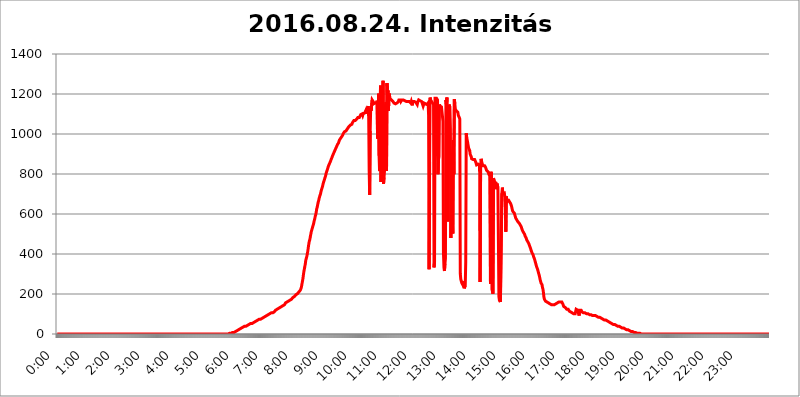
| Category | 2016.08.24. Intenzitás [W/m^2] |
|---|---|
| 0.0 | 0 |
| 0.0006944444444444445 | 0 |
| 0.001388888888888889 | 0 |
| 0.0020833333333333333 | 0 |
| 0.002777777777777778 | 0 |
| 0.003472222222222222 | 0 |
| 0.004166666666666667 | 0 |
| 0.004861111111111111 | 0 |
| 0.005555555555555556 | 0 |
| 0.0062499999999999995 | 0 |
| 0.006944444444444444 | 0 |
| 0.007638888888888889 | 0 |
| 0.008333333333333333 | 0 |
| 0.009027777777777779 | 0 |
| 0.009722222222222222 | 0 |
| 0.010416666666666666 | 0 |
| 0.011111111111111112 | 0 |
| 0.011805555555555555 | 0 |
| 0.012499999999999999 | 0 |
| 0.013194444444444444 | 0 |
| 0.013888888888888888 | 0 |
| 0.014583333333333332 | 0 |
| 0.015277777777777777 | 0 |
| 0.015972222222222224 | 0 |
| 0.016666666666666666 | 0 |
| 0.017361111111111112 | 0 |
| 0.018055555555555557 | 0 |
| 0.01875 | 0 |
| 0.019444444444444445 | 0 |
| 0.02013888888888889 | 0 |
| 0.020833333333333332 | 0 |
| 0.02152777777777778 | 0 |
| 0.022222222222222223 | 0 |
| 0.02291666666666667 | 0 |
| 0.02361111111111111 | 0 |
| 0.024305555555555556 | 0 |
| 0.024999999999999998 | 0 |
| 0.025694444444444447 | 0 |
| 0.02638888888888889 | 0 |
| 0.027083333333333334 | 0 |
| 0.027777777777777776 | 0 |
| 0.02847222222222222 | 0 |
| 0.029166666666666664 | 0 |
| 0.029861111111111113 | 0 |
| 0.030555555555555555 | 0 |
| 0.03125 | 0 |
| 0.03194444444444445 | 0 |
| 0.03263888888888889 | 0 |
| 0.03333333333333333 | 0 |
| 0.034027777777777775 | 0 |
| 0.034722222222222224 | 0 |
| 0.035416666666666666 | 0 |
| 0.036111111111111115 | 0 |
| 0.03680555555555556 | 0 |
| 0.0375 | 0 |
| 0.03819444444444444 | 0 |
| 0.03888888888888889 | 0 |
| 0.03958333333333333 | 0 |
| 0.04027777777777778 | 0 |
| 0.04097222222222222 | 0 |
| 0.041666666666666664 | 0 |
| 0.042361111111111106 | 0 |
| 0.04305555555555556 | 0 |
| 0.043750000000000004 | 0 |
| 0.044444444444444446 | 0 |
| 0.04513888888888889 | 0 |
| 0.04583333333333334 | 0 |
| 0.04652777777777778 | 0 |
| 0.04722222222222222 | 0 |
| 0.04791666666666666 | 0 |
| 0.04861111111111111 | 0 |
| 0.049305555555555554 | 0 |
| 0.049999999999999996 | 0 |
| 0.05069444444444445 | 0 |
| 0.051388888888888894 | 0 |
| 0.052083333333333336 | 0 |
| 0.05277777777777778 | 0 |
| 0.05347222222222222 | 0 |
| 0.05416666666666667 | 0 |
| 0.05486111111111111 | 0 |
| 0.05555555555555555 | 0 |
| 0.05625 | 0 |
| 0.05694444444444444 | 0 |
| 0.057638888888888885 | 0 |
| 0.05833333333333333 | 0 |
| 0.05902777777777778 | 0 |
| 0.059722222222222225 | 0 |
| 0.06041666666666667 | 0 |
| 0.061111111111111116 | 0 |
| 0.06180555555555556 | 0 |
| 0.0625 | 0 |
| 0.06319444444444444 | 0 |
| 0.06388888888888888 | 0 |
| 0.06458333333333334 | 0 |
| 0.06527777777777778 | 0 |
| 0.06597222222222222 | 0 |
| 0.06666666666666667 | 0 |
| 0.06736111111111111 | 0 |
| 0.06805555555555555 | 0 |
| 0.06874999999999999 | 0 |
| 0.06944444444444443 | 0 |
| 0.07013888888888889 | 0 |
| 0.07083333333333333 | 0 |
| 0.07152777777777779 | 0 |
| 0.07222222222222223 | 0 |
| 0.07291666666666667 | 0 |
| 0.07361111111111111 | 0 |
| 0.07430555555555556 | 0 |
| 0.075 | 0 |
| 0.07569444444444444 | 0 |
| 0.0763888888888889 | 0 |
| 0.07708333333333334 | 0 |
| 0.07777777777777778 | 0 |
| 0.07847222222222222 | 0 |
| 0.07916666666666666 | 0 |
| 0.0798611111111111 | 0 |
| 0.08055555555555556 | 0 |
| 0.08125 | 0 |
| 0.08194444444444444 | 0 |
| 0.08263888888888889 | 0 |
| 0.08333333333333333 | 0 |
| 0.08402777777777777 | 0 |
| 0.08472222222222221 | 0 |
| 0.08541666666666665 | 0 |
| 0.08611111111111112 | 0 |
| 0.08680555555555557 | 0 |
| 0.08750000000000001 | 0 |
| 0.08819444444444445 | 0 |
| 0.08888888888888889 | 0 |
| 0.08958333333333333 | 0 |
| 0.09027777777777778 | 0 |
| 0.09097222222222222 | 0 |
| 0.09166666666666667 | 0 |
| 0.09236111111111112 | 0 |
| 0.09305555555555556 | 0 |
| 0.09375 | 0 |
| 0.09444444444444444 | 0 |
| 0.09513888888888888 | 0 |
| 0.09583333333333333 | 0 |
| 0.09652777777777777 | 0 |
| 0.09722222222222222 | 0 |
| 0.09791666666666667 | 0 |
| 0.09861111111111111 | 0 |
| 0.09930555555555555 | 0 |
| 0.09999999999999999 | 0 |
| 0.10069444444444443 | 0 |
| 0.1013888888888889 | 0 |
| 0.10208333333333335 | 0 |
| 0.10277777777777779 | 0 |
| 0.10347222222222223 | 0 |
| 0.10416666666666667 | 0 |
| 0.10486111111111111 | 0 |
| 0.10555555555555556 | 0 |
| 0.10625 | 0 |
| 0.10694444444444444 | 0 |
| 0.1076388888888889 | 0 |
| 0.10833333333333334 | 0 |
| 0.10902777777777778 | 0 |
| 0.10972222222222222 | 0 |
| 0.1111111111111111 | 0 |
| 0.11180555555555556 | 0 |
| 0.11180555555555556 | 0 |
| 0.1125 | 0 |
| 0.11319444444444444 | 0 |
| 0.11388888888888889 | 0 |
| 0.11458333333333333 | 0 |
| 0.11527777777777777 | 0 |
| 0.11597222222222221 | 0 |
| 0.11666666666666665 | 0 |
| 0.1173611111111111 | 0 |
| 0.11805555555555557 | 0 |
| 0.11944444444444445 | 0 |
| 0.12013888888888889 | 0 |
| 0.12083333333333333 | 0 |
| 0.12152777777777778 | 0 |
| 0.12222222222222223 | 0 |
| 0.12291666666666667 | 0 |
| 0.12291666666666667 | 0 |
| 0.12361111111111112 | 0 |
| 0.12430555555555556 | 0 |
| 0.125 | 0 |
| 0.12569444444444444 | 0 |
| 0.12638888888888888 | 0 |
| 0.12708333333333333 | 0 |
| 0.16875 | 0 |
| 0.12847222222222224 | 0 |
| 0.12916666666666668 | 0 |
| 0.12986111111111112 | 0 |
| 0.13055555555555556 | 0 |
| 0.13125 | 0 |
| 0.13194444444444445 | 0 |
| 0.1326388888888889 | 0 |
| 0.13333333333333333 | 0 |
| 0.13402777777777777 | 0 |
| 0.13402777777777777 | 0 |
| 0.13472222222222222 | 0 |
| 0.13541666666666666 | 0 |
| 0.1361111111111111 | 0 |
| 0.13749999999999998 | 0 |
| 0.13819444444444443 | 0 |
| 0.1388888888888889 | 0 |
| 0.13958333333333334 | 0 |
| 0.14027777777777778 | 0 |
| 0.14097222222222222 | 0 |
| 0.14166666666666666 | 0 |
| 0.1423611111111111 | 0 |
| 0.14305555555555557 | 0 |
| 0.14375000000000002 | 0 |
| 0.14444444444444446 | 0 |
| 0.1451388888888889 | 0 |
| 0.1451388888888889 | 0 |
| 0.14652777777777778 | 0 |
| 0.14722222222222223 | 0 |
| 0.14791666666666667 | 0 |
| 0.1486111111111111 | 0 |
| 0.14930555555555555 | 0 |
| 0.15 | 0 |
| 0.15069444444444444 | 0 |
| 0.15138888888888888 | 0 |
| 0.15208333333333332 | 0 |
| 0.15277777777777776 | 0 |
| 0.15347222222222223 | 0 |
| 0.15416666666666667 | 0 |
| 0.15486111111111112 | 0 |
| 0.15555555555555556 | 0 |
| 0.15625 | 0 |
| 0.15694444444444444 | 0 |
| 0.15763888888888888 | 0 |
| 0.15833333333333333 | 0 |
| 0.15902777777777777 | 0 |
| 0.15972222222222224 | 0 |
| 0.16041666666666668 | 0 |
| 0.16111111111111112 | 0 |
| 0.16180555555555556 | 0 |
| 0.1625 | 0 |
| 0.16319444444444445 | 0 |
| 0.1638888888888889 | 0 |
| 0.16458333333333333 | 0 |
| 0.16527777777777777 | 0 |
| 0.16597222222222222 | 0 |
| 0.16666666666666666 | 0 |
| 0.1673611111111111 | 0 |
| 0.16805555555555554 | 0 |
| 0.16874999999999998 | 0 |
| 0.16944444444444443 | 0 |
| 0.17013888888888887 | 0 |
| 0.1708333333333333 | 0 |
| 0.17152777777777775 | 0 |
| 0.17222222222222225 | 0 |
| 0.1729166666666667 | 0 |
| 0.17361111111111113 | 0 |
| 0.17430555555555557 | 0 |
| 0.17500000000000002 | 0 |
| 0.17569444444444446 | 0 |
| 0.1763888888888889 | 0 |
| 0.17708333333333334 | 0 |
| 0.17777777777777778 | 0 |
| 0.17847222222222223 | 0 |
| 0.17916666666666667 | 0 |
| 0.1798611111111111 | 0 |
| 0.18055555555555555 | 0 |
| 0.18125 | 0 |
| 0.18194444444444444 | 0 |
| 0.1826388888888889 | 0 |
| 0.18333333333333335 | 0 |
| 0.1840277777777778 | 0 |
| 0.18472222222222223 | 0 |
| 0.18541666666666667 | 0 |
| 0.18611111111111112 | 0 |
| 0.18680555555555556 | 0 |
| 0.1875 | 0 |
| 0.18819444444444444 | 0 |
| 0.18888888888888888 | 0 |
| 0.18958333333333333 | 0 |
| 0.19027777777777777 | 0 |
| 0.1909722222222222 | 0 |
| 0.19166666666666665 | 0 |
| 0.19236111111111112 | 0 |
| 0.19305555555555554 | 0 |
| 0.19375 | 0 |
| 0.19444444444444445 | 0 |
| 0.1951388888888889 | 0 |
| 0.19583333333333333 | 0 |
| 0.19652777777777777 | 0 |
| 0.19722222222222222 | 0 |
| 0.19791666666666666 | 0 |
| 0.1986111111111111 | 0 |
| 0.19930555555555554 | 0 |
| 0.19999999999999998 | 0 |
| 0.20069444444444443 | 0 |
| 0.20138888888888887 | 0 |
| 0.2020833333333333 | 0 |
| 0.2027777777777778 | 0 |
| 0.2034722222222222 | 0 |
| 0.2041666666666667 | 0 |
| 0.20486111111111113 | 0 |
| 0.20555555555555557 | 0 |
| 0.20625000000000002 | 0 |
| 0.20694444444444446 | 0 |
| 0.2076388888888889 | 0 |
| 0.20833333333333334 | 0 |
| 0.20902777777777778 | 0 |
| 0.20972222222222223 | 0 |
| 0.21041666666666667 | 0 |
| 0.2111111111111111 | 0 |
| 0.21180555555555555 | 0 |
| 0.2125 | 0 |
| 0.21319444444444444 | 0 |
| 0.2138888888888889 | 0 |
| 0.21458333333333335 | 0 |
| 0.2152777777777778 | 0 |
| 0.21597222222222223 | 0 |
| 0.21666666666666667 | 0 |
| 0.21736111111111112 | 0 |
| 0.21805555555555556 | 0 |
| 0.21875 | 0 |
| 0.21944444444444444 | 0 |
| 0.22013888888888888 | 0 |
| 0.22083333333333333 | 0 |
| 0.22152777777777777 | 0 |
| 0.2222222222222222 | 0 |
| 0.22291666666666665 | 0 |
| 0.2236111111111111 | 0 |
| 0.22430555555555556 | 0 |
| 0.225 | 0 |
| 0.22569444444444445 | 0 |
| 0.2263888888888889 | 0 |
| 0.22708333333333333 | 0 |
| 0.22777777777777777 | 0 |
| 0.22847222222222222 | 0 |
| 0.22916666666666666 | 0 |
| 0.2298611111111111 | 0 |
| 0.23055555555555554 | 0 |
| 0.23124999999999998 | 0 |
| 0.23194444444444443 | 0 |
| 0.23263888888888887 | 0 |
| 0.2333333333333333 | 0 |
| 0.2340277777777778 | 0 |
| 0.2347222222222222 | 0 |
| 0.2354166666666667 | 0 |
| 0.23611111111111113 | 0 |
| 0.23680555555555557 | 0 |
| 0.23750000000000002 | 0 |
| 0.23819444444444446 | 0 |
| 0.2388888888888889 | 0 |
| 0.23958333333333334 | 0 |
| 0.24027777777777778 | 3.525 |
| 0.24097222222222223 | 3.525 |
| 0.24166666666666667 | 3.525 |
| 0.2423611111111111 | 3.525 |
| 0.24305555555555555 | 3.525 |
| 0.24375 | 3.525 |
| 0.24444444444444446 | 3.525 |
| 0.24513888888888888 | 7.887 |
| 0.24583333333333335 | 7.887 |
| 0.2465277777777778 | 7.887 |
| 0.24722222222222223 | 7.887 |
| 0.24791666666666667 | 7.887 |
| 0.24861111111111112 | 12.257 |
| 0.24930555555555556 | 12.257 |
| 0.25 | 12.257 |
| 0.25069444444444444 | 12.257 |
| 0.2513888888888889 | 16.636 |
| 0.2520833333333333 | 16.636 |
| 0.25277777777777777 | 21.024 |
| 0.2534722222222222 | 21.024 |
| 0.25416666666666665 | 21.024 |
| 0.2548611111111111 | 21.024 |
| 0.2555555555555556 | 25.419 |
| 0.25625000000000003 | 25.419 |
| 0.2569444444444445 | 25.419 |
| 0.2576388888888889 | 29.823 |
| 0.25833333333333336 | 29.823 |
| 0.2590277777777778 | 29.823 |
| 0.25972222222222224 | 29.823 |
| 0.2604166666666667 | 34.234 |
| 0.2611111111111111 | 34.234 |
| 0.26180555555555557 | 34.234 |
| 0.2625 | 38.653 |
| 0.26319444444444445 | 38.653 |
| 0.2638888888888889 | 38.653 |
| 0.26458333333333334 | 38.653 |
| 0.2652777777777778 | 38.653 |
| 0.2659722222222222 | 43.079 |
| 0.26666666666666666 | 43.079 |
| 0.2673611111111111 | 43.079 |
| 0.26805555555555555 | 47.511 |
| 0.26875 | 47.511 |
| 0.26944444444444443 | 47.511 |
| 0.2701388888888889 | 47.511 |
| 0.2708333333333333 | 51.951 |
| 0.27152777777777776 | 51.951 |
| 0.2722222222222222 | 51.951 |
| 0.27291666666666664 | 51.951 |
| 0.2736111111111111 | 56.398 |
| 0.2743055555555555 | 56.398 |
| 0.27499999999999997 | 56.398 |
| 0.27569444444444446 | 60.85 |
| 0.27638888888888885 | 60.85 |
| 0.27708333333333335 | 60.85 |
| 0.2777777777777778 | 65.31 |
| 0.27847222222222223 | 65.31 |
| 0.2791666666666667 | 65.31 |
| 0.2798611111111111 | 65.31 |
| 0.28055555555555556 | 69.775 |
| 0.28125 | 69.775 |
| 0.28194444444444444 | 69.775 |
| 0.2826388888888889 | 69.775 |
| 0.2833333333333333 | 74.246 |
| 0.28402777777777777 | 74.246 |
| 0.2847222222222222 | 74.246 |
| 0.28541666666666665 | 74.246 |
| 0.28611111111111115 | 78.722 |
| 0.28680555555555554 | 78.722 |
| 0.28750000000000003 | 78.722 |
| 0.2881944444444445 | 78.722 |
| 0.2888888888888889 | 83.205 |
| 0.28958333333333336 | 83.205 |
| 0.2902777777777778 | 83.205 |
| 0.29097222222222224 | 87.692 |
| 0.2916666666666667 | 87.692 |
| 0.2923611111111111 | 87.692 |
| 0.29305555555555557 | 92.184 |
| 0.29375 | 92.184 |
| 0.29444444444444445 | 92.184 |
| 0.2951388888888889 | 92.184 |
| 0.29583333333333334 | 96.682 |
| 0.2965277777777778 | 96.682 |
| 0.2972222222222222 | 101.184 |
| 0.29791666666666666 | 101.184 |
| 0.2986111111111111 | 101.184 |
| 0.29930555555555555 | 101.184 |
| 0.3 | 105.69 |
| 0.30069444444444443 | 105.69 |
| 0.3013888888888889 | 105.69 |
| 0.3020833333333333 | 105.69 |
| 0.30277777777777776 | 110.201 |
| 0.3034722222222222 | 110.201 |
| 0.30416666666666664 | 110.201 |
| 0.3048611111111111 | 114.716 |
| 0.3055555555555555 | 114.716 |
| 0.30624999999999997 | 119.235 |
| 0.3069444444444444 | 119.235 |
| 0.3076388888888889 | 119.235 |
| 0.30833333333333335 | 123.758 |
| 0.3090277777777778 | 123.758 |
| 0.30972222222222223 | 128.284 |
| 0.3104166666666667 | 128.284 |
| 0.3111111111111111 | 128.284 |
| 0.31180555555555556 | 132.814 |
| 0.3125 | 132.814 |
| 0.31319444444444444 | 132.814 |
| 0.3138888888888889 | 137.347 |
| 0.3145833333333333 | 137.347 |
| 0.31527777777777777 | 137.347 |
| 0.3159722222222222 | 141.884 |
| 0.31666666666666665 | 141.884 |
| 0.31736111111111115 | 146.423 |
| 0.31805555555555554 | 146.423 |
| 0.31875000000000003 | 146.423 |
| 0.3194444444444445 | 150.964 |
| 0.3201388888888889 | 155.509 |
| 0.32083333333333336 | 155.509 |
| 0.3215277777777778 | 155.509 |
| 0.32222222222222224 | 160.056 |
| 0.3229166666666667 | 160.056 |
| 0.3236111111111111 | 164.605 |
| 0.32430555555555557 | 164.605 |
| 0.325 | 164.605 |
| 0.32569444444444445 | 169.156 |
| 0.3263888888888889 | 169.156 |
| 0.32708333333333334 | 173.709 |
| 0.3277777777777778 | 173.709 |
| 0.3284722222222222 | 173.709 |
| 0.32916666666666666 | 178.264 |
| 0.3298611111111111 | 178.264 |
| 0.33055555555555555 | 182.82 |
| 0.33125 | 182.82 |
| 0.33194444444444443 | 187.378 |
| 0.3326388888888889 | 187.378 |
| 0.3333333333333333 | 191.937 |
| 0.3340277777777778 | 191.937 |
| 0.3347222222222222 | 196.497 |
| 0.3354166666666667 | 196.497 |
| 0.3361111111111111 | 201.058 |
| 0.3368055555555556 | 201.058 |
| 0.33749999999999997 | 205.62 |
| 0.33819444444444446 | 205.62 |
| 0.33888888888888885 | 210.182 |
| 0.33958333333333335 | 210.182 |
| 0.34027777777777773 | 214.746 |
| 0.34097222222222223 | 219.309 |
| 0.3416666666666666 | 223.873 |
| 0.3423611111111111 | 233 |
| 0.3430555555555555 | 246.689 |
| 0.34375 | 260.373 |
| 0.3444444444444445 | 274.047 |
| 0.3451388888888889 | 292.259 |
| 0.3458333333333334 | 310.44 |
| 0.34652777777777777 | 324.052 |
| 0.34722222222222227 | 337.639 |
| 0.34791666666666665 | 351.198 |
| 0.34861111111111115 | 369.23 |
| 0.34930555555555554 | 378.224 |
| 0.35000000000000003 | 387.202 |
| 0.3506944444444444 | 400.638 |
| 0.3513888888888889 | 414.035 |
| 0.3520833333333333 | 431.833 |
| 0.3527777777777778 | 449.551 |
| 0.3534722222222222 | 462.786 |
| 0.3541666666666667 | 471.582 |
| 0.3548611111111111 | 484.735 |
| 0.35555555555555557 | 497.836 |
| 0.35625 | 510.885 |
| 0.35694444444444445 | 519.555 |
| 0.3576388888888889 | 528.2 |
| 0.35833333333333334 | 536.82 |
| 0.3590277777777778 | 545.416 |
| 0.3597222222222222 | 553.986 |
| 0.36041666666666666 | 566.793 |
| 0.3611111111111111 | 575.299 |
| 0.36180555555555555 | 588.009 |
| 0.3625 | 596.45 |
| 0.36319444444444443 | 609.062 |
| 0.3638888888888889 | 625.784 |
| 0.3645833333333333 | 634.105 |
| 0.3652777777777778 | 646.537 |
| 0.3659722222222222 | 658.909 |
| 0.3666666666666667 | 667.123 |
| 0.3673611111111111 | 679.395 |
| 0.3680555555555556 | 683.473 |
| 0.36874999999999997 | 695.666 |
| 0.36944444444444446 | 703.762 |
| 0.37013888888888885 | 715.858 |
| 0.37083333333333335 | 719.877 |
| 0.37152777777777773 | 731.896 |
| 0.37222222222222223 | 739.877 |
| 0.3729166666666666 | 751.803 |
| 0.3736111111111111 | 759.723 |
| 0.3743055555555555 | 767.62 |
| 0.375 | 775.492 |
| 0.3756944444444445 | 783.342 |
| 0.3763888888888889 | 791.169 |
| 0.3770833333333334 | 802.868 |
| 0.37777777777777777 | 810.641 |
| 0.37847222222222227 | 818.392 |
| 0.37916666666666665 | 826.123 |
| 0.37986111111111115 | 829.981 |
| 0.38055555555555554 | 841.526 |
| 0.38125000000000003 | 845.365 |
| 0.3819444444444444 | 853.029 |
| 0.3826388888888889 | 856.855 |
| 0.3833333333333333 | 864.493 |
| 0.3840277777777778 | 872.114 |
| 0.3847222222222222 | 875.918 |
| 0.3854166666666667 | 883.516 |
| 0.3861111111111111 | 891.099 |
| 0.38680555555555557 | 894.885 |
| 0.3875 | 902.447 |
| 0.38819444444444445 | 906.223 |
| 0.3888888888888889 | 913.766 |
| 0.38958333333333334 | 917.534 |
| 0.3902777777777778 | 925.06 |
| 0.3909722222222222 | 928.819 |
| 0.39166666666666666 | 936.33 |
| 0.3923611111111111 | 940.082 |
| 0.39305555555555555 | 947.58 |
| 0.39375 | 947.58 |
| 0.39444444444444443 | 955.071 |
| 0.3951388888888889 | 958.814 |
| 0.3958333333333333 | 970.034 |
| 0.3965277777777778 | 970.034 |
| 0.3972222222222222 | 977.508 |
| 0.3979166666666667 | 981.244 |
| 0.3986111111111111 | 984.98 |
| 0.3993055555555556 | 988.714 |
| 0.39999999999999997 | 992.448 |
| 0.40069444444444446 | 996.182 |
| 0.40138888888888885 | 1003.65 |
| 0.40208333333333335 | 1003.65 |
| 0.40277777777777773 | 1011.118 |
| 0.40347222222222223 | 1011.118 |
| 0.4041666666666666 | 1014.852 |
| 0.4048611111111111 | 1014.852 |
| 0.4055555555555555 | 1018.587 |
| 0.40625 | 1022.323 |
| 0.4069444444444445 | 1026.06 |
| 0.4076388888888889 | 1029.798 |
| 0.4083333333333334 | 1033.537 |
| 0.40902777777777777 | 1037.277 |
| 0.40972222222222227 | 1037.277 |
| 0.41041666666666665 | 1037.277 |
| 0.41111111111111115 | 1044.762 |
| 0.41180555555555554 | 1048.508 |
| 0.41250000000000003 | 1048.508 |
| 0.4131944444444444 | 1048.508 |
| 0.4138888888888889 | 1056.004 |
| 0.4145833333333333 | 1059.756 |
| 0.4152777777777778 | 1059.756 |
| 0.4159722222222222 | 1067.267 |
| 0.4166666666666667 | 1067.267 |
| 0.4173611111111111 | 1067.267 |
| 0.41805555555555557 | 1067.267 |
| 0.41875 | 1071.027 |
| 0.41944444444444445 | 1071.027 |
| 0.4201388888888889 | 1074.789 |
| 0.42083333333333334 | 1078.555 |
| 0.4215277777777778 | 1082.324 |
| 0.4222222222222222 | 1082.324 |
| 0.42291666666666666 | 1082.324 |
| 0.4236111111111111 | 1082.324 |
| 0.42430555555555555 | 1082.324 |
| 0.425 | 1086.097 |
| 0.42569444444444443 | 1097.437 |
| 0.4263888888888889 | 1097.437 |
| 0.4270833333333333 | 1097.437 |
| 0.4277777777777778 | 1101.226 |
| 0.4284722222222222 | 1093.653 |
| 0.4291666666666667 | 1101.226 |
| 0.4298611111111111 | 1101.226 |
| 0.4305555555555556 | 1101.226 |
| 0.43124999999999997 | 1105.019 |
| 0.43194444444444446 | 1108.816 |
| 0.43263888888888885 | 1116.426 |
| 0.43333333333333335 | 1101.226 |
| 0.43402777777777773 | 1120.238 |
| 0.43472222222222223 | 1120.238 |
| 0.4354166666666666 | 1124.056 |
| 0.4361111111111111 | 1139.384 |
| 0.4368055555555555 | 1089.873 |
| 0.4375 | 814.519 |
| 0.4381944444444445 | 695.666 |
| 0.4388888888888889 | 1014.852 |
| 0.4395833333333334 | 1127.879 |
| 0.44027777777777777 | 1116.426 |
| 0.44097222222222227 | 1120.238 |
| 0.44166666666666665 | 1170.358 |
| 0.44236111111111115 | 1170.358 |
| 0.44305555555555554 | 1162.571 |
| 0.44375000000000003 | 1150.946 |
| 0.4444444444444444 | 1150.946 |
| 0.4451388888888889 | 1150.946 |
| 0.4458333333333333 | 1154.814 |
| 0.4465277777777778 | 1154.814 |
| 0.4472222222222222 | 1150.946 |
| 0.4479166666666667 | 1154.814 |
| 0.4486111111111111 | 1166.46 |
| 0.44930555555555557 | 977.508 |
| 0.45 | 1033.537 |
| 0.45069444444444445 | 1201.843 |
| 0.4513888888888889 | 891.099 |
| 0.45208333333333334 | 814.519 |
| 0.4527777777777778 | 1162.571 |
| 0.4534722222222222 | 1242.089 |
| 0.45416666666666666 | 759.723 |
| 0.4548611111111111 | 921.298 |
| 0.45555555555555555 | 966.295 |
| 0.45625 | 1007.383 |
| 0.45694444444444443 | 1266.8 |
| 0.4576388888888889 | 751.803 |
| 0.4583333333333333 | 783.342 |
| 0.4590277777777778 | 818.392 |
| 0.4597222222222222 | 1147.086 |
| 0.4604166666666667 | 951.327 |
| 0.4611111111111111 | 1158.689 |
| 0.4618055555555556 | 814.519 |
| 0.46249999999999997 | 1254.387 |
| 0.46319444444444446 | 1189.969 |
| 0.46388888888888885 | 1217.812 |
| 0.46458333333333335 | 1116.426 |
| 0.46527777777777773 | 1201.843 |
| 0.46597222222222223 | 1193.918 |
| 0.4666666666666666 | 1178.177 |
| 0.4673611111111111 | 1174.263 |
| 0.4680555555555555 | 1178.177 |
| 0.46875 | 1170.358 |
| 0.4694444444444445 | 1170.358 |
| 0.4701388888888889 | 1166.46 |
| 0.4708333333333334 | 1162.571 |
| 0.47152777777777777 | 1162.571 |
| 0.47222222222222227 | 1154.814 |
| 0.47291666666666665 | 1154.814 |
| 0.47361111111111115 | 1150.946 |
| 0.47430555555555554 | 1150.946 |
| 0.47500000000000003 | 1150.946 |
| 0.4756944444444444 | 1154.814 |
| 0.4763888888888889 | 1154.814 |
| 0.4770833333333333 | 1154.814 |
| 0.4777777777777778 | 1158.689 |
| 0.4784722222222222 | 1162.571 |
| 0.4791666666666667 | 1170.358 |
| 0.4798611111111111 | 1174.263 |
| 0.48055555555555557 | 1174.263 |
| 0.48125 | 1170.358 |
| 0.48194444444444445 | 1162.571 |
| 0.4826388888888889 | 1162.571 |
| 0.48333333333333334 | 1170.358 |
| 0.4840277777777778 | 1170.358 |
| 0.4847222222222222 | 1170.358 |
| 0.48541666666666666 | 1170.358 |
| 0.4861111111111111 | 1170.358 |
| 0.48680555555555555 | 1170.358 |
| 0.4875 | 1166.46 |
| 0.48819444444444443 | 1162.571 |
| 0.4888888888888889 | 1162.571 |
| 0.4895833333333333 | 1162.571 |
| 0.4902777777777778 | 1166.46 |
| 0.4909722222222222 | 1162.571 |
| 0.4916666666666667 | 1162.571 |
| 0.4923611111111111 | 1162.571 |
| 0.4930555555555556 | 1162.571 |
| 0.49374999999999997 | 1162.571 |
| 0.49444444444444446 | 1162.571 |
| 0.49513888888888885 | 1162.571 |
| 0.49583333333333335 | 1154.814 |
| 0.49652777777777773 | 1162.571 |
| 0.49722222222222223 | 1158.689 |
| 0.4979166666666666 | 1143.232 |
| 0.4986111111111111 | 1162.571 |
| 0.4993055555555555 | 1166.46 |
| 0.5 | 1166.46 |
| 0.5006944444444444 | 1162.571 |
| 0.5013888888888889 | 1166.46 |
| 0.5020833333333333 | 1162.571 |
| 0.5027777777777778 | 1158.689 |
| 0.5034722222222222 | 1162.571 |
| 0.5041666666666667 | 1158.689 |
| 0.5048611111111111 | 1147.086 |
| 0.5055555555555555 | 1158.689 |
| 0.50625 | 1158.689 |
| 0.5069444444444444 | 1170.358 |
| 0.5076388888888889 | 1174.263 |
| 0.5083333333333333 | 1174.263 |
| 0.5090277777777777 | 1166.46 |
| 0.5097222222222222 | 1170.358 |
| 0.5104166666666666 | 1166.46 |
| 0.5111111111111112 | 1162.571 |
| 0.5118055555555555 | 1154.814 |
| 0.5125000000000001 | 1147.086 |
| 0.5131944444444444 | 1139.384 |
| 0.513888888888889 | 1147.086 |
| 0.5145833333333333 | 1154.814 |
| 0.5152777777777778 | 1158.689 |
| 0.5159722222222222 | 1154.814 |
| 0.5166666666666667 | 1150.946 |
| 0.517361111111111 | 1147.086 |
| 0.5180555555555556 | 1150.946 |
| 0.5187499999999999 | 1147.086 |
| 0.5194444444444445 | 1147.086 |
| 0.5201388888888888 | 1154.814 |
| 0.5208333333333334 | 1093.653 |
| 0.5215277777777778 | 324.052 |
| 0.5222222222222223 | 860.676 |
| 0.5229166666666667 | 1182.099 |
| 0.5236111111111111 | 1170.358 |
| 0.5243055555555556 | 1166.46 |
| 0.525 | 1166.46 |
| 0.5256944444444445 | 1158.689 |
| 0.5263888888888889 | 1154.814 |
| 0.5270833333333333 | 1154.814 |
| 0.5277777777777778 | 1147.086 |
| 0.5284722222222222 | 333.113 |
| 0.5291666666666667 | 360.221 |
| 0.5298611111111111 | 1178.177 |
| 0.5305555555555556 | 1178.177 |
| 0.53125 | 1178.177 |
| 0.5319444444444444 | 1178.177 |
| 0.5326388888888889 | 1174.263 |
| 0.5333333333333333 | 1170.358 |
| 0.5340277777777778 | 798.974 |
| 0.5347222222222222 | 872.114 |
| 0.5354166666666667 | 887.309 |
| 0.5361111111111111 | 1147.086 |
| 0.5368055555555555 | 1139.384 |
| 0.5375 | 1139.384 |
| 0.5381944444444444 | 1135.543 |
| 0.5388888888888889 | 1135.543 |
| 0.5395833333333333 | 1139.384 |
| 0.5402777777777777 | 1135.543 |
| 0.5409722222222222 | 1063.51 |
| 0.5416666666666666 | 405.108 |
| 0.5423611111111112 | 333.113 |
| 0.5430555555555555 | 314.98 |
| 0.5437500000000001 | 351.198 |
| 0.5444444444444444 | 378.224 |
| 0.545138888888889 | 1170.358 |
| 0.5458333333333333 | 1147.086 |
| 0.5465277777777778 | 1182.099 |
| 0.5472222222222222 | 675.311 |
| 0.5479166666666667 | 562.53 |
| 0.548611111111111 | 1014.852 |
| 0.5493055555555556 | 1147.086 |
| 0.5499999999999999 | 1147.086 |
| 0.5506944444444445 | 1135.543 |
| 0.5513888888888888 | 1029.798 |
| 0.5520833333333334 | 480.356 |
| 0.5527777777777778 | 872.114 |
| 0.5534722222222223 | 613.252 |
| 0.5541666666666667 | 575.299 |
| 0.5548611111111111 | 502.192 |
| 0.5555555555555556 | 970.034 |
| 0.55625 | 798.974 |
| 0.5569444444444445 | 1174.263 |
| 0.5576388888888889 | 1150.946 |
| 0.5583333333333333 | 1124.056 |
| 0.5590277777777778 | 1124.056 |
| 0.5597222222222222 | 1116.426 |
| 0.5604166666666667 | 1116.426 |
| 0.5611111111111111 | 1112.618 |
| 0.5618055555555556 | 1108.816 |
| 0.5625 | 1093.653 |
| 0.5631944444444444 | 1093.653 |
| 0.5638888888888889 | 1082.324 |
| 0.5645833333333333 | 1074.789 |
| 0.5652777777777778 | 301.354 |
| 0.5659722222222222 | 274.047 |
| 0.5666666666666667 | 264.932 |
| 0.5673611111111111 | 255.813 |
| 0.5680555555555555 | 251.251 |
| 0.56875 | 246.689 |
| 0.5694444444444444 | 255.813 |
| 0.5701388888888889 | 264.932 |
| 0.5708333333333333 | 228.436 |
| 0.5715277777777777 | 228.436 |
| 0.5722222222222222 | 242.127 |
| 0.5729166666666666 | 360.221 |
| 0.5736111111111112 | 1003.65 |
| 0.5743055555555555 | 981.244 |
| 0.5750000000000001 | 970.034 |
| 0.5756944444444444 | 955.071 |
| 0.576388888888889 | 940.082 |
| 0.5770833333333333 | 928.819 |
| 0.5777777777777778 | 925.06 |
| 0.5784722222222222 | 917.534 |
| 0.5791666666666667 | 898.668 |
| 0.579861111111111 | 898.668 |
| 0.5805555555555556 | 887.309 |
| 0.5812499999999999 | 875.918 |
| 0.5819444444444445 | 879.719 |
| 0.5826388888888888 | 875.918 |
| 0.5833333333333334 | 872.114 |
| 0.5840277777777778 | 872.114 |
| 0.5847222222222223 | 868.305 |
| 0.5854166666666667 | 872.114 |
| 0.5861111111111111 | 868.305 |
| 0.5868055555555556 | 860.676 |
| 0.5875 | 853.029 |
| 0.5881944444444445 | 845.365 |
| 0.5888888888888889 | 841.526 |
| 0.5895833333333333 | 849.199 |
| 0.5902777777777778 | 849.199 |
| 0.5909722222222222 | 845.365 |
| 0.5916666666666667 | 853.029 |
| 0.5923611111111111 | 845.365 |
| 0.5930555555555556 | 260.373 |
| 0.59375 | 829.981 |
| 0.5944444444444444 | 875.918 |
| 0.5951388888888889 | 864.493 |
| 0.5958333333333333 | 853.029 |
| 0.5965277777777778 | 853.029 |
| 0.5972222222222222 | 841.526 |
| 0.5979166666666667 | 841.526 |
| 0.5986111111111111 | 841.526 |
| 0.5993055555555555 | 841.526 |
| 0.6 | 837.682 |
| 0.6006944444444444 | 833.834 |
| 0.6013888888888889 | 829.981 |
| 0.6020833333333333 | 818.392 |
| 0.6027777777777777 | 814.519 |
| 0.6034722222222222 | 814.519 |
| 0.6041666666666666 | 810.641 |
| 0.6048611111111112 | 810.641 |
| 0.6055555555555555 | 806.757 |
| 0.6062500000000001 | 791.169 |
| 0.6069444444444444 | 810.641 |
| 0.607638888888889 | 251.251 |
| 0.6083333333333333 | 810.641 |
| 0.6090277777777778 | 798.974 |
| 0.6097222222222222 | 223.873 |
| 0.6104166666666667 | 219.309 |
| 0.611111111111111 | 201.058 |
| 0.6118055555555556 | 779.42 |
| 0.6124999999999999 | 775.492 |
| 0.6131944444444445 | 759.723 |
| 0.6138888888888888 | 759.723 |
| 0.6145833333333334 | 759.723 |
| 0.6152777777777778 | 755.766 |
| 0.6159722222222223 | 723.889 |
| 0.6166666666666667 | 751.803 |
| 0.6173611111111111 | 747.834 |
| 0.6180555555555556 | 731.896 |
| 0.61875 | 467.187 |
| 0.6194444444444445 | 187.378 |
| 0.6201388888888889 | 169.156 |
| 0.6208333333333333 | 164.605 |
| 0.6215277777777778 | 160.056 |
| 0.6222222222222222 | 155.509 |
| 0.6229166666666667 | 160.056 |
| 0.6236111111111111 | 703.762 |
| 0.6243055555555556 | 731.896 |
| 0.625 | 699.717 |
| 0.6256944444444444 | 695.666 |
| 0.6263888888888889 | 699.717 |
| 0.6270833333333333 | 703.762 |
| 0.6277777777777778 | 687.544 |
| 0.6284722222222222 | 642.4 |
| 0.6291666666666667 | 510.885 |
| 0.6298611111111111 | 687.544 |
| 0.6305555555555555 | 671.22 |
| 0.63125 | 663.019 |
| 0.6319444444444444 | 663.019 |
| 0.6326388888888889 | 658.909 |
| 0.6333333333333333 | 667.123 |
| 0.6340277777777777 | 667.123 |
| 0.6347222222222222 | 658.909 |
| 0.6354166666666666 | 654.791 |
| 0.6361111111111112 | 650.667 |
| 0.6368055555555555 | 642.4 |
| 0.6375000000000001 | 634.105 |
| 0.6381944444444444 | 621.613 |
| 0.638888888888889 | 613.252 |
| 0.6395833333333333 | 613.252 |
| 0.6402777777777778 | 609.062 |
| 0.6409722222222222 | 604.864 |
| 0.6416666666666667 | 596.45 |
| 0.642361111111111 | 588.009 |
| 0.6430555555555556 | 579.542 |
| 0.6437499999999999 | 575.299 |
| 0.6444444444444445 | 571.049 |
| 0.6451388888888888 | 566.793 |
| 0.6458333333333334 | 562.53 |
| 0.6465277777777778 | 562.53 |
| 0.6472222222222223 | 558.261 |
| 0.6479166666666667 | 553.986 |
| 0.6486111111111111 | 549.704 |
| 0.6493055555555556 | 545.416 |
| 0.65 | 541.121 |
| 0.6506944444444445 | 536.82 |
| 0.6513888888888889 | 528.2 |
| 0.6520833333333333 | 523.88 |
| 0.6527777777777778 | 515.223 |
| 0.6534722222222222 | 510.885 |
| 0.6541666666666667 | 506.542 |
| 0.6548611111111111 | 502.192 |
| 0.6555555555555556 | 497.836 |
| 0.65625 | 489.108 |
| 0.6569444444444444 | 484.735 |
| 0.6576388888888889 | 480.356 |
| 0.6583333333333333 | 471.582 |
| 0.6590277777777778 | 467.187 |
| 0.6597222222222222 | 462.786 |
| 0.6604166666666667 | 458.38 |
| 0.6611111111111111 | 453.968 |
| 0.6618055555555555 | 449.551 |
| 0.6625 | 440.702 |
| 0.6631944444444444 | 436.27 |
| 0.6638888888888889 | 427.39 |
| 0.6645833333333333 | 418.492 |
| 0.6652777777777777 | 414.035 |
| 0.6659722222222222 | 405.108 |
| 0.6666666666666666 | 400.638 |
| 0.6673611111111111 | 396.164 |
| 0.6680555555555556 | 387.202 |
| 0.6687500000000001 | 382.715 |
| 0.6694444444444444 | 373.729 |
| 0.6701388888888888 | 364.728 |
| 0.6708333333333334 | 355.712 |
| 0.6715277777777778 | 346.682 |
| 0.6722222222222222 | 337.639 |
| 0.6729166666666666 | 333.113 |
| 0.6736111111111112 | 324.052 |
| 0.6743055555555556 | 314.98 |
| 0.6749999999999999 | 305.898 |
| 0.6756944444444444 | 296.808 |
| 0.6763888888888889 | 287.709 |
| 0.6770833333333334 | 274.047 |
| 0.6777777777777777 | 264.932 |
| 0.6784722222222223 | 255.813 |
| 0.6791666666666667 | 251.251 |
| 0.6798611111111111 | 246.689 |
| 0.6805555555555555 | 233 |
| 0.68125 | 223.873 |
| 0.6819444444444445 | 205.62 |
| 0.6826388888888889 | 182.82 |
| 0.6833333333333332 | 173.709 |
| 0.6840277777777778 | 169.156 |
| 0.6847222222222222 | 164.605 |
| 0.6854166666666667 | 164.605 |
| 0.686111111111111 | 164.605 |
| 0.6868055555555556 | 160.056 |
| 0.6875 | 160.056 |
| 0.6881944444444444 | 160.056 |
| 0.688888888888889 | 155.509 |
| 0.6895833333333333 | 155.509 |
| 0.6902777777777778 | 150.964 |
| 0.6909722222222222 | 150.964 |
| 0.6916666666666668 | 150.964 |
| 0.6923611111111111 | 146.423 |
| 0.6930555555555555 | 146.423 |
| 0.69375 | 146.423 |
| 0.6944444444444445 | 146.423 |
| 0.6951388888888889 | 146.423 |
| 0.6958333333333333 | 146.423 |
| 0.6965277777777777 | 146.423 |
| 0.6972222222222223 | 146.423 |
| 0.6979166666666666 | 146.423 |
| 0.6986111111111111 | 146.423 |
| 0.6993055555555556 | 150.964 |
| 0.7000000000000001 | 155.509 |
| 0.7006944444444444 | 155.509 |
| 0.7013888888888888 | 155.509 |
| 0.7020833333333334 | 160.056 |
| 0.7027777777777778 | 155.509 |
| 0.7034722222222222 | 160.056 |
| 0.7041666666666666 | 160.056 |
| 0.7048611111111112 | 160.056 |
| 0.7055555555555556 | 160.056 |
| 0.7062499999999999 | 160.056 |
| 0.7069444444444444 | 164.605 |
| 0.7076388888888889 | 160.056 |
| 0.7083333333333334 | 155.509 |
| 0.7090277777777777 | 150.964 |
| 0.7097222222222223 | 146.423 |
| 0.7104166666666667 | 137.347 |
| 0.7111111111111111 | 137.347 |
| 0.7118055555555555 | 132.814 |
| 0.7125 | 132.814 |
| 0.7131944444444445 | 128.284 |
| 0.7138888888888889 | 128.284 |
| 0.7145833333333332 | 123.758 |
| 0.7152777777777778 | 123.758 |
| 0.7159722222222222 | 123.758 |
| 0.7166666666666667 | 123.758 |
| 0.717361111111111 | 119.235 |
| 0.7180555555555556 | 114.716 |
| 0.71875 | 114.716 |
| 0.7194444444444444 | 114.716 |
| 0.720138888888889 | 110.201 |
| 0.7208333333333333 | 110.201 |
| 0.7215277777777778 | 105.69 |
| 0.7222222222222222 | 105.69 |
| 0.7229166666666668 | 105.69 |
| 0.7236111111111111 | 105.69 |
| 0.7243055555555555 | 101.184 |
| 0.725 | 101.184 |
| 0.7256944444444445 | 101.184 |
| 0.7263888888888889 | 101.184 |
| 0.7270833333333333 | 101.184 |
| 0.7277777777777777 | 123.758 |
| 0.7284722222222223 | 123.758 |
| 0.7291666666666666 | 119.235 |
| 0.7298611111111111 | 119.235 |
| 0.7305555555555556 | 119.235 |
| 0.7312500000000001 | 119.235 |
| 0.7319444444444444 | 92.184 |
| 0.7326388888888888 | 119.235 |
| 0.7333333333333334 | 119.235 |
| 0.7340277777777778 | 119.235 |
| 0.7347222222222222 | 119.235 |
| 0.7354166666666666 | 114.716 |
| 0.7361111111111112 | 110.201 |
| 0.7368055555555556 | 110.201 |
| 0.7374999999999999 | 110.201 |
| 0.7381944444444444 | 105.69 |
| 0.7388888888888889 | 105.69 |
| 0.7395833333333334 | 105.69 |
| 0.7402777777777777 | 105.69 |
| 0.7409722222222223 | 105.69 |
| 0.7416666666666667 | 101.184 |
| 0.7423611111111111 | 101.184 |
| 0.7430555555555555 | 101.184 |
| 0.74375 | 101.184 |
| 0.7444444444444445 | 101.184 |
| 0.7451388888888889 | 101.184 |
| 0.7458333333333332 | 101.184 |
| 0.7465277777777778 | 96.682 |
| 0.7472222222222222 | 96.682 |
| 0.7479166666666667 | 96.682 |
| 0.748611111111111 | 96.682 |
| 0.7493055555555556 | 96.682 |
| 0.75 | 96.682 |
| 0.7506944444444444 | 92.184 |
| 0.751388888888889 | 92.184 |
| 0.7520833333333333 | 92.184 |
| 0.7527777777777778 | 92.184 |
| 0.7534722222222222 | 92.184 |
| 0.7541666666666668 | 92.184 |
| 0.7548611111111111 | 92.184 |
| 0.7555555555555555 | 92.184 |
| 0.75625 | 92.184 |
| 0.7569444444444445 | 87.692 |
| 0.7576388888888889 | 87.692 |
| 0.7583333333333333 | 87.692 |
| 0.7590277777777777 | 83.205 |
| 0.7597222222222223 | 83.205 |
| 0.7604166666666666 | 83.205 |
| 0.7611111111111111 | 83.205 |
| 0.7618055555555556 | 78.722 |
| 0.7625000000000001 | 78.722 |
| 0.7631944444444444 | 78.722 |
| 0.7638888888888888 | 78.722 |
| 0.7645833333333334 | 74.246 |
| 0.7652777777777778 | 74.246 |
| 0.7659722222222222 | 74.246 |
| 0.7666666666666666 | 74.246 |
| 0.7673611111111112 | 69.775 |
| 0.7680555555555556 | 69.775 |
| 0.7687499999999999 | 69.775 |
| 0.7694444444444444 | 69.775 |
| 0.7701388888888889 | 65.31 |
| 0.7708333333333334 | 65.31 |
| 0.7715277777777777 | 65.31 |
| 0.7722222222222223 | 65.31 |
| 0.7729166666666667 | 60.85 |
| 0.7736111111111111 | 60.85 |
| 0.7743055555555555 | 56.398 |
| 0.775 | 56.398 |
| 0.7756944444444445 | 56.398 |
| 0.7763888888888889 | 56.398 |
| 0.7770833333333332 | 51.951 |
| 0.7777777777777778 | 51.951 |
| 0.7784722222222222 | 51.951 |
| 0.7791666666666667 | 51.951 |
| 0.779861111111111 | 47.511 |
| 0.7805555555555556 | 47.511 |
| 0.78125 | 47.511 |
| 0.7819444444444444 | 47.511 |
| 0.782638888888889 | 43.079 |
| 0.7833333333333333 | 43.079 |
| 0.7840277777777778 | 43.079 |
| 0.7847222222222222 | 43.079 |
| 0.7854166666666668 | 43.079 |
| 0.7861111111111111 | 38.653 |
| 0.7868055555555555 | 38.653 |
| 0.7875 | 38.653 |
| 0.7881944444444445 | 38.653 |
| 0.7888888888888889 | 34.234 |
| 0.7895833333333333 | 34.234 |
| 0.7902777777777777 | 34.234 |
| 0.7909722222222223 | 29.823 |
| 0.7916666666666666 | 29.823 |
| 0.7923611111111111 | 29.823 |
| 0.7930555555555556 | 29.823 |
| 0.7937500000000001 | 29.823 |
| 0.7944444444444444 | 29.823 |
| 0.7951388888888888 | 25.419 |
| 0.7958333333333334 | 25.419 |
| 0.7965277777777778 | 25.419 |
| 0.7972222222222222 | 25.419 |
| 0.7979166666666666 | 25.419 |
| 0.7986111111111112 | 21.024 |
| 0.7993055555555556 | 21.024 |
| 0.7999999999999999 | 21.024 |
| 0.8006944444444444 | 21.024 |
| 0.8013888888888889 | 21.024 |
| 0.8020833333333334 | 16.636 |
| 0.8027777777777777 | 16.636 |
| 0.8034722222222223 | 16.636 |
| 0.8041666666666667 | 16.636 |
| 0.8048611111111111 | 12.257 |
| 0.8055555555555555 | 12.257 |
| 0.80625 | 12.257 |
| 0.8069444444444445 | 12.257 |
| 0.8076388888888889 | 12.257 |
| 0.8083333333333332 | 12.257 |
| 0.8090277777777778 | 7.887 |
| 0.8097222222222222 | 7.887 |
| 0.8104166666666667 | 7.887 |
| 0.811111111111111 | 7.887 |
| 0.8118055555555556 | 7.887 |
| 0.8125 | 3.525 |
| 0.8131944444444444 | 3.525 |
| 0.813888888888889 | 3.525 |
| 0.8145833333333333 | 3.525 |
| 0.8152777777777778 | 3.525 |
| 0.8159722222222222 | 3.525 |
| 0.8166666666666668 | 3.525 |
| 0.8173611111111111 | 3.525 |
| 0.8180555555555555 | 3.525 |
| 0.81875 | 0 |
| 0.8194444444444445 | 0 |
| 0.8201388888888889 | 0 |
| 0.8208333333333333 | 0 |
| 0.8215277777777777 | 0 |
| 0.8222222222222223 | 0 |
| 0.8229166666666666 | 0 |
| 0.8236111111111111 | 0 |
| 0.8243055555555556 | 0 |
| 0.8250000000000001 | 0 |
| 0.8256944444444444 | 0 |
| 0.8263888888888888 | 0 |
| 0.8270833333333334 | 0 |
| 0.8277777777777778 | 0 |
| 0.8284722222222222 | 0 |
| 0.8291666666666666 | 0 |
| 0.8298611111111112 | 0 |
| 0.8305555555555556 | 0 |
| 0.8312499999999999 | 0 |
| 0.8319444444444444 | 0 |
| 0.8326388888888889 | 0 |
| 0.8333333333333334 | 0 |
| 0.8340277777777777 | 0 |
| 0.8347222222222223 | 0 |
| 0.8354166666666667 | 0 |
| 0.8361111111111111 | 0 |
| 0.8368055555555555 | 0 |
| 0.8375 | 0 |
| 0.8381944444444445 | 0 |
| 0.8388888888888889 | 0 |
| 0.8395833333333332 | 0 |
| 0.8402777777777778 | 0 |
| 0.8409722222222222 | 0 |
| 0.8416666666666667 | 0 |
| 0.842361111111111 | 0 |
| 0.8430555555555556 | 0 |
| 0.84375 | 0 |
| 0.8444444444444444 | 0 |
| 0.845138888888889 | 0 |
| 0.8458333333333333 | 0 |
| 0.8465277777777778 | 0 |
| 0.8472222222222222 | 0 |
| 0.8479166666666668 | 0 |
| 0.8486111111111111 | 0 |
| 0.8493055555555555 | 0 |
| 0.85 | 0 |
| 0.8506944444444445 | 0 |
| 0.8513888888888889 | 0 |
| 0.8520833333333333 | 0 |
| 0.8527777777777777 | 0 |
| 0.8534722222222223 | 0 |
| 0.8541666666666666 | 0 |
| 0.8548611111111111 | 0 |
| 0.8555555555555556 | 0 |
| 0.8562500000000001 | 0 |
| 0.8569444444444444 | 0 |
| 0.8576388888888888 | 0 |
| 0.8583333333333334 | 0 |
| 0.8590277777777778 | 0 |
| 0.8597222222222222 | 0 |
| 0.8604166666666666 | 0 |
| 0.8611111111111112 | 0 |
| 0.8618055555555556 | 0 |
| 0.8624999999999999 | 0 |
| 0.8631944444444444 | 0 |
| 0.8638888888888889 | 0 |
| 0.8645833333333334 | 0 |
| 0.8652777777777777 | 0 |
| 0.8659722222222223 | 0 |
| 0.8666666666666667 | 0 |
| 0.8673611111111111 | 0 |
| 0.8680555555555555 | 0 |
| 0.86875 | 0 |
| 0.8694444444444445 | 0 |
| 0.8701388888888889 | 0 |
| 0.8708333333333332 | 0 |
| 0.8715277777777778 | 0 |
| 0.8722222222222222 | 0 |
| 0.8729166666666667 | 0 |
| 0.873611111111111 | 0 |
| 0.8743055555555556 | 0 |
| 0.875 | 0 |
| 0.8756944444444444 | 0 |
| 0.876388888888889 | 0 |
| 0.8770833333333333 | 0 |
| 0.8777777777777778 | 0 |
| 0.8784722222222222 | 0 |
| 0.8791666666666668 | 0 |
| 0.8798611111111111 | 0 |
| 0.8805555555555555 | 0 |
| 0.88125 | 0 |
| 0.8819444444444445 | 0 |
| 0.8826388888888889 | 0 |
| 0.8833333333333333 | 0 |
| 0.8840277777777777 | 0 |
| 0.8847222222222223 | 0 |
| 0.8854166666666666 | 0 |
| 0.8861111111111111 | 0 |
| 0.8868055555555556 | 0 |
| 0.8875000000000001 | 0 |
| 0.8881944444444444 | 0 |
| 0.8888888888888888 | 0 |
| 0.8895833333333334 | 0 |
| 0.8902777777777778 | 0 |
| 0.8909722222222222 | 0 |
| 0.8916666666666666 | 0 |
| 0.8923611111111112 | 0 |
| 0.8930555555555556 | 0 |
| 0.8937499999999999 | 0 |
| 0.8944444444444444 | 0 |
| 0.8951388888888889 | 0 |
| 0.8958333333333334 | 0 |
| 0.8965277777777777 | 0 |
| 0.8972222222222223 | 0 |
| 0.8979166666666667 | 0 |
| 0.8986111111111111 | 0 |
| 0.8993055555555555 | 0 |
| 0.9 | 0 |
| 0.9006944444444445 | 0 |
| 0.9013888888888889 | 0 |
| 0.9020833333333332 | 0 |
| 0.9027777777777778 | 0 |
| 0.9034722222222222 | 0 |
| 0.9041666666666667 | 0 |
| 0.904861111111111 | 0 |
| 0.9055555555555556 | 0 |
| 0.90625 | 0 |
| 0.9069444444444444 | 0 |
| 0.907638888888889 | 0 |
| 0.9083333333333333 | 0 |
| 0.9090277777777778 | 0 |
| 0.9097222222222222 | 0 |
| 0.9104166666666668 | 0 |
| 0.9111111111111111 | 0 |
| 0.9118055555555555 | 0 |
| 0.9125 | 0 |
| 0.9131944444444445 | 0 |
| 0.9138888888888889 | 0 |
| 0.9145833333333333 | 0 |
| 0.9152777777777777 | 0 |
| 0.9159722222222223 | 0 |
| 0.9166666666666666 | 0 |
| 0.9173611111111111 | 0 |
| 0.9180555555555556 | 0 |
| 0.9187500000000001 | 0 |
| 0.9194444444444444 | 0 |
| 0.9201388888888888 | 0 |
| 0.9208333333333334 | 0 |
| 0.9215277777777778 | 0 |
| 0.9222222222222222 | 0 |
| 0.9229166666666666 | 0 |
| 0.9236111111111112 | 0 |
| 0.9243055555555556 | 0 |
| 0.9249999999999999 | 0 |
| 0.9256944444444444 | 0 |
| 0.9263888888888889 | 0 |
| 0.9270833333333334 | 0 |
| 0.9277777777777777 | 0 |
| 0.9284722222222223 | 0 |
| 0.9291666666666667 | 0 |
| 0.9298611111111111 | 0 |
| 0.9305555555555555 | 0 |
| 0.93125 | 0 |
| 0.9319444444444445 | 0 |
| 0.9326388888888889 | 0 |
| 0.9333333333333332 | 0 |
| 0.9340277777777778 | 0 |
| 0.9347222222222222 | 0 |
| 0.9354166666666667 | 0 |
| 0.936111111111111 | 0 |
| 0.9368055555555556 | 0 |
| 0.9375 | 0 |
| 0.9381944444444444 | 0 |
| 0.938888888888889 | 0 |
| 0.9395833333333333 | 0 |
| 0.9402777777777778 | 0 |
| 0.9409722222222222 | 0 |
| 0.9416666666666668 | 0 |
| 0.9423611111111111 | 0 |
| 0.9430555555555555 | 0 |
| 0.94375 | 0 |
| 0.9444444444444445 | 0 |
| 0.9451388888888889 | 0 |
| 0.9458333333333333 | 0 |
| 0.9465277777777777 | 0 |
| 0.9472222222222223 | 0 |
| 0.9479166666666666 | 0 |
| 0.9486111111111111 | 0 |
| 0.9493055555555556 | 0 |
| 0.9500000000000001 | 0 |
| 0.9506944444444444 | 0 |
| 0.9513888888888888 | 0 |
| 0.9520833333333334 | 0 |
| 0.9527777777777778 | 0 |
| 0.9534722222222222 | 0 |
| 0.9541666666666666 | 0 |
| 0.9548611111111112 | 0 |
| 0.9555555555555556 | 0 |
| 0.9562499999999999 | 0 |
| 0.9569444444444444 | 0 |
| 0.9576388888888889 | 0 |
| 0.9583333333333334 | 0 |
| 0.9590277777777777 | 0 |
| 0.9597222222222223 | 0 |
| 0.9604166666666667 | 0 |
| 0.9611111111111111 | 0 |
| 0.9618055555555555 | 0 |
| 0.9625 | 0 |
| 0.9631944444444445 | 0 |
| 0.9638888888888889 | 0 |
| 0.9645833333333332 | 0 |
| 0.9652777777777778 | 0 |
| 0.9659722222222222 | 0 |
| 0.9666666666666667 | 0 |
| 0.967361111111111 | 0 |
| 0.9680555555555556 | 0 |
| 0.96875 | 0 |
| 0.9694444444444444 | 0 |
| 0.970138888888889 | 0 |
| 0.9708333333333333 | 0 |
| 0.9715277777777778 | 0 |
| 0.9722222222222222 | 0 |
| 0.9729166666666668 | 0 |
| 0.9736111111111111 | 0 |
| 0.9743055555555555 | 0 |
| 0.975 | 0 |
| 0.9756944444444445 | 0 |
| 0.9763888888888889 | 0 |
| 0.9770833333333333 | 0 |
| 0.9777777777777777 | 0 |
| 0.9784722222222223 | 0 |
| 0.9791666666666666 | 0 |
| 0.9798611111111111 | 0 |
| 0.9805555555555556 | 0 |
| 0.9812500000000001 | 0 |
| 0.9819444444444444 | 0 |
| 0.9826388888888888 | 0 |
| 0.9833333333333334 | 0 |
| 0.9840277777777778 | 0 |
| 0.9847222222222222 | 0 |
| 0.9854166666666666 | 0 |
| 0.9861111111111112 | 0 |
| 0.9868055555555556 | 0 |
| 0.9874999999999999 | 0 |
| 0.9881944444444444 | 0 |
| 0.9888888888888889 | 0 |
| 0.9895833333333334 | 0 |
| 0.9902777777777777 | 0 |
| 0.9909722222222223 | 0 |
| 0.9916666666666667 | 0 |
| 0.9923611111111111 | 0 |
| 0.9930555555555555 | 0 |
| 0.99375 | 0 |
| 0.9944444444444445 | 0 |
| 0.9951388888888889 | 0 |
| 0.9958333333333332 | 0 |
| 0.9965277777777778 | 0 |
| 0.9972222222222222 | 0 |
| 0.9979166666666667 | 0 |
| 0.998611111111111 | 0 |
| 0.9993055555555556 | 0 |